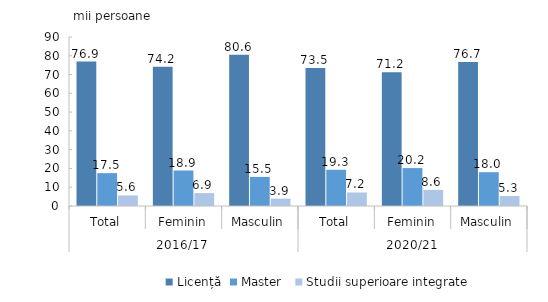
| Category | Licență | Master  | Studii superioare integrate |
|---|---|---|---|
| 0 | 76.9 | 17.5 | 5.6 |
| 1 | 74.2 | 18.9 | 6.9 |
| 2 | 80.6 | 15.5 | 3.9 |
| 3 | 73.5 | 19.3 | 7.2 |
| 4 | 71.2 | 20.2 | 8.6 |
| 5 | 76.7 | 18 | 5.3 |